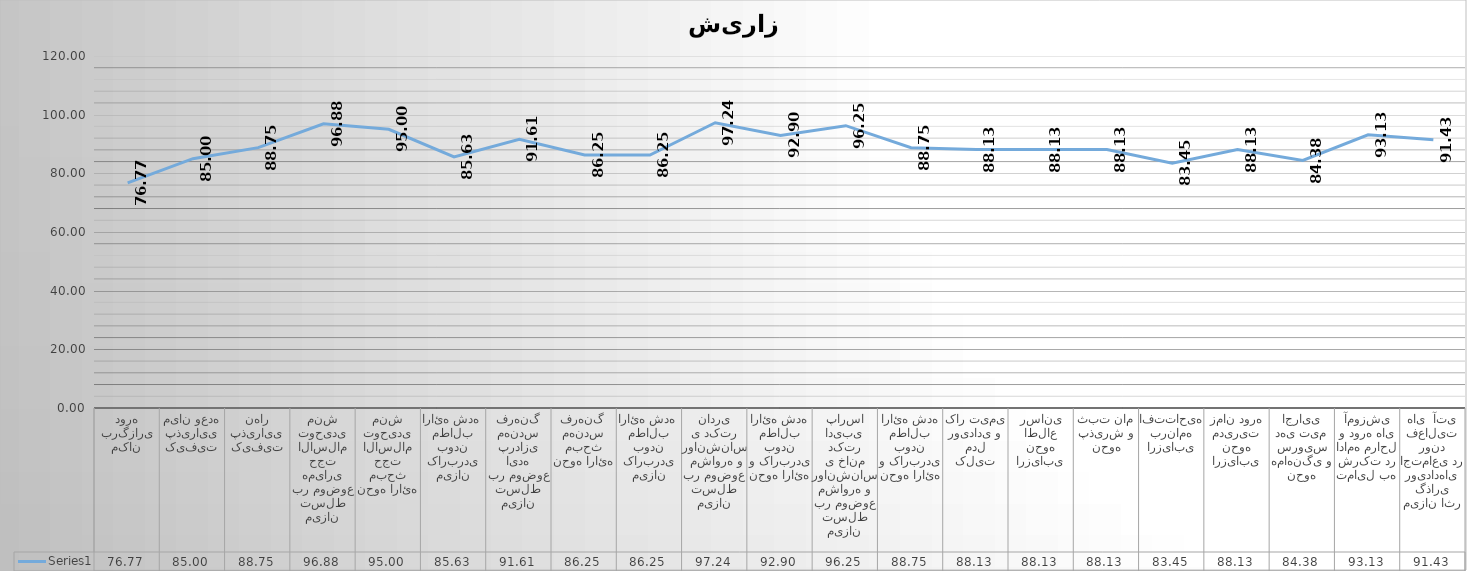
| Category | Series 0 |
|---|---|
| مکان برگزاری دوره | 76.774 |
| کیفیت پذیرایی میان وعده | 85 |
| کیفیت پذیرایی نهار | 88.75 |
| میزان تسلط بر موضوع همیاری حجت الاسلام توحیدی منش | 96.875 |
| نحوه ارائه مبحث حجت الاسلام توحیدی منش | 95 |
| میزان کاربردی بودن مطالب ارائه شده  | 85.625 |
| میزان تسلط بر موضوع ایده پردازی مهندس فرهنگ | 91.613 |
| نحوه ارائه مبحث مهندس فرهنگ  | 86.25 |
| میزان کاربردی بودن مطالب ارائه شده  | 86.25 |
| میزان تسلط بر موضوع  مشاوره و روانشناسی دکتر نادری | 97.241 |
| نحوه ارائه و کاربردی بودن مطالب ارائه شده | 92.903 |
| میزان تسلط بر موضوع مشاوره و روانشناسی خانم دکتر ادیبی پارسا | 96.25 |
| نحوه ارائه و کاربردی بودن مطالب ارائه شده | 88.75 |
| کلیت مدل رویدادی و کار تیمی | 88.125 |
| ارزیابی نحوه اطلاع رسانی | 88.125 |
| نحوه پذیرش و ثبت نام | 88.125 |
| ارزیابی برنامه افتتاحیه  | 83.448 |
| ارزیابی نحوه مدیریت زمان دوره | 88.125 |
| نحوه هماهنگی و سرویس دهی تیم اجرایی | 84.375 |
| تمایل به شرکت در ادامه مراحل و دوره های آموزشی | 93.125 |
| میزان اثر گذاری رویدادهای اجتماعی در روند فعالیت های  آتی | 91.429 |